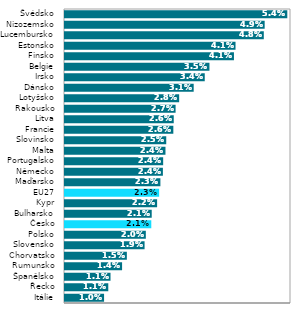
| Category | Series 0 |
|---|---|
| Itálie | 0.01 |
| Řecko | 0.011 |
| Španělsko | 0.011 |
| Rumunsko | 0.014 |
| Chorvatsko | 0.015 |
| Slovensko | 0.019 |
| Polsko | 0.02 |
| Česko | 0.021 |
| Bulharsko | 0.021 |
| Kypr | 0.022 |
| EU27 | 0.023 |
| Maďarsko | 0.023 |
| Německo | 0.024 |
| Portugalsko | 0.024 |
| Malta | 0.024 |
| Slovinsko | 0.025 |
| Francie | 0.026 |
| Litva | 0.026 |
| Rakousko | 0.027 |
| Lotyšsko | 0.028 |
| Dánsko | 0.031 |
| Irsko | 0.034 |
| Belgie | 0.035 |
| Finsko | 0.041 |
| Estonsko | 0.041 |
| Lucembursko | 0.048 |
| Nizozemsko | 0.049 |
| Švédsko | 0.054 |